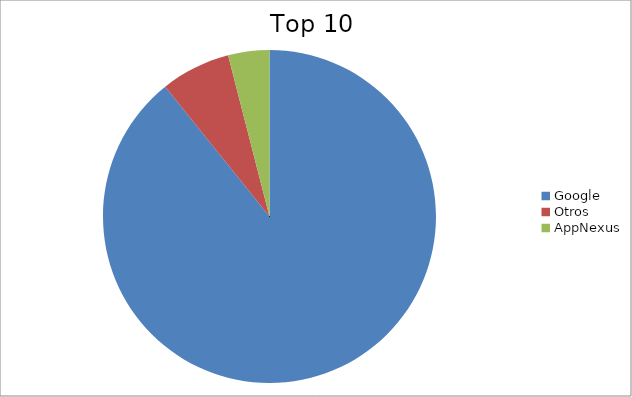
| Category | Series 0 |
|---|---|
| Google | 89.22 |
| Otros | 6.77 |
| AppNexus | 4 |